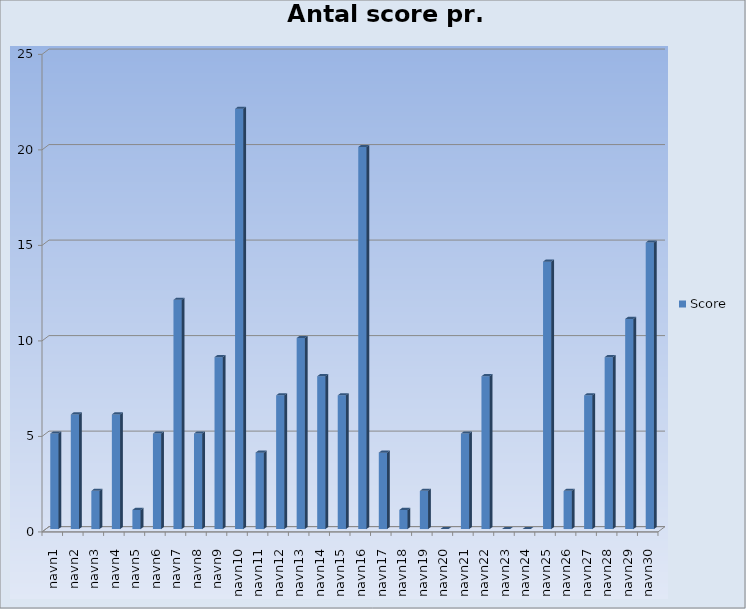
| Category | Score |
|---|---|
| navn1 | 5 |
| navn2 | 6 |
| navn3 | 2 |
| navn4 | 6 |
| navn5 | 1 |
| navn6 | 5 |
| navn7 | 12 |
| navn8 | 5 |
| navn9 | 9 |
| navn10 | 22 |
| navn11 | 4 |
| navn12 | 7 |
| navn13 | 10 |
| navn14 | 8 |
| navn15 | 7 |
| navn16 | 20 |
| navn17 | 4 |
| navn18 | 1 |
| navn19 | 2 |
| navn20 | 0 |
| navn21 | 5 |
| navn22 | 8 |
| navn23 | 0 |
| navn24 | 0 |
| navn25 | 14 |
| navn26 | 2 |
| navn27 | 7 |
| navn28 | 9 |
| navn29 | 11 |
| navn30 | 15 |